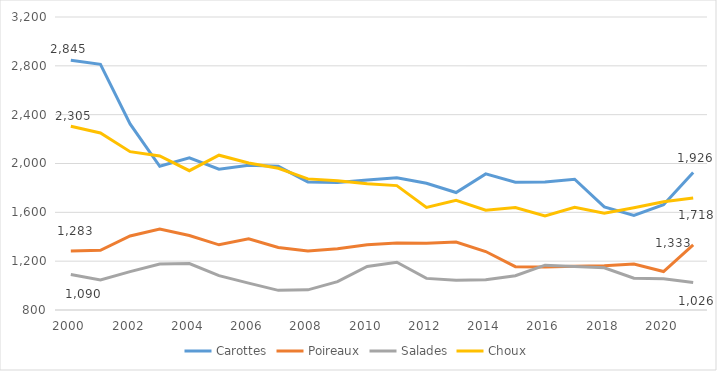
| Category | Carottes | Poireaux | Salades | Choux |
|---|---|---|---|---|
| 2000.0 | 2845 | 1283 | 1090 | 2305 |
| 2001.0 | 2812 | 1289 | 1046 | 2250 |
| 2002.0 | 2324 | 1406 | 1114 | 2097 |
| 2003.0 | 1977 | 1463 | 1177 | 2062 |
| 2004.0 | 2047 | 1410 | 1180 | 1941 |
| 2005.0 | 1953 | 1334 | 1081 | 2068 |
| 2006.0 | 1986 | 1383 | 1020 | 2004 |
| 2007.0 | 1977 | 1312 | 961 | 1961 |
| 2008.0 | 1849 | 1283 | 965 | 1874 |
| 2009.0 | 1845 | 1302 | 1032 | 1859 |
| 2010.0 | 1865 | 1335 | 1157 | 1835 |
| 2011.0 | 1883 | 1349 | 1191 | 1819 |
| 2012.0 | 1838 | 1346 | 1059 | 1640 |
| 2013.0 | 1762 | 1357 | 1044 | 1699 |
| 2014.0 | 1915 | 1279 | 1047 | 1618 |
| 2015.0 | 1847 | 1155 | 1081 | 1640 |
| 2016.0 | 1848 | 1153 | 1167 | 1571 |
| 2017.0 | 1871 | 1159 | 1157 | 1642 |
| 2018.0 | 1645 | 1162 | 1146 | 1593 |
| 2019.0 | 1574 | 1176 | 1061 | 1638 |
| 2020.0 | 1662 | 1115 | 1055 | 1686 |
| 2021.0 | 1926 | 1333 | 1026 | 1718 |